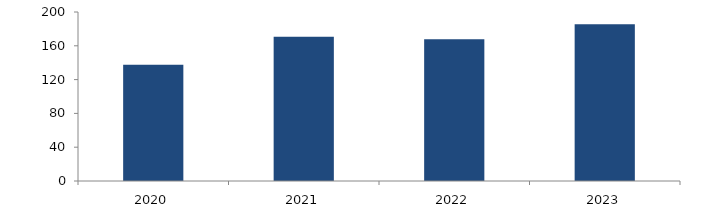
| Category | Bogotá |
|---|---|
| 2020.0 | 137.482 |
| 2021.0 | 170.703 |
| 2022.0 | 167.684 |
| 2023.0 | 185.65 |